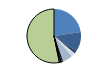
| Category | Series 0 |
|---|---|
| ARRASTRE | 298 |
| CERCO | 157 |
| ATUNEROS CAÑEROS | 21 |
| PALANGRE DE FONDO | 32 |
| PALANGRE DE SUPERFICIE | 74 |
| RASCO | 10 |
| VOLANTA | 12 |
| ARTES FIJAS | 12 |
| ARTES MENORES | 701 |